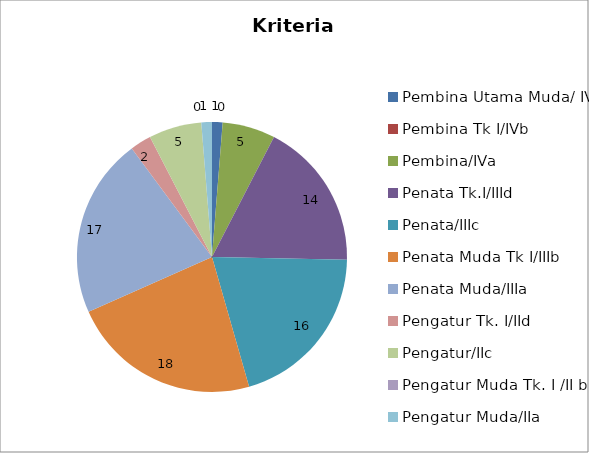
| Category | Jumlah |
|---|---|
| Pembina Utama Muda/ IVc | 1 |
| Pembina Tk I/IVb | 0 |
| Pembina/IVa | 5 |
| Penata Tk.I/IIId | 14 |
| Penata/IIIc | 16 |
| Penata Muda Tk I/IIIb | 18 |
| Penata Muda/IIIa | 17 |
| Pengatur Tk. I/IId | 2 |
| Pengatur/IIc | 5 |
| Pengatur Muda Tk. I /II b | 0 |
| Pengatur Muda/IIa | 1 |